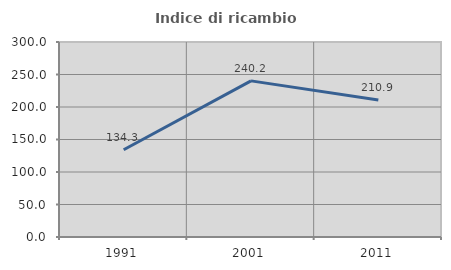
| Category | Indice di ricambio occupazionale  |
|---|---|
| 1991.0 | 134.286 |
| 2001.0 | 240.196 |
| 2011.0 | 210.909 |